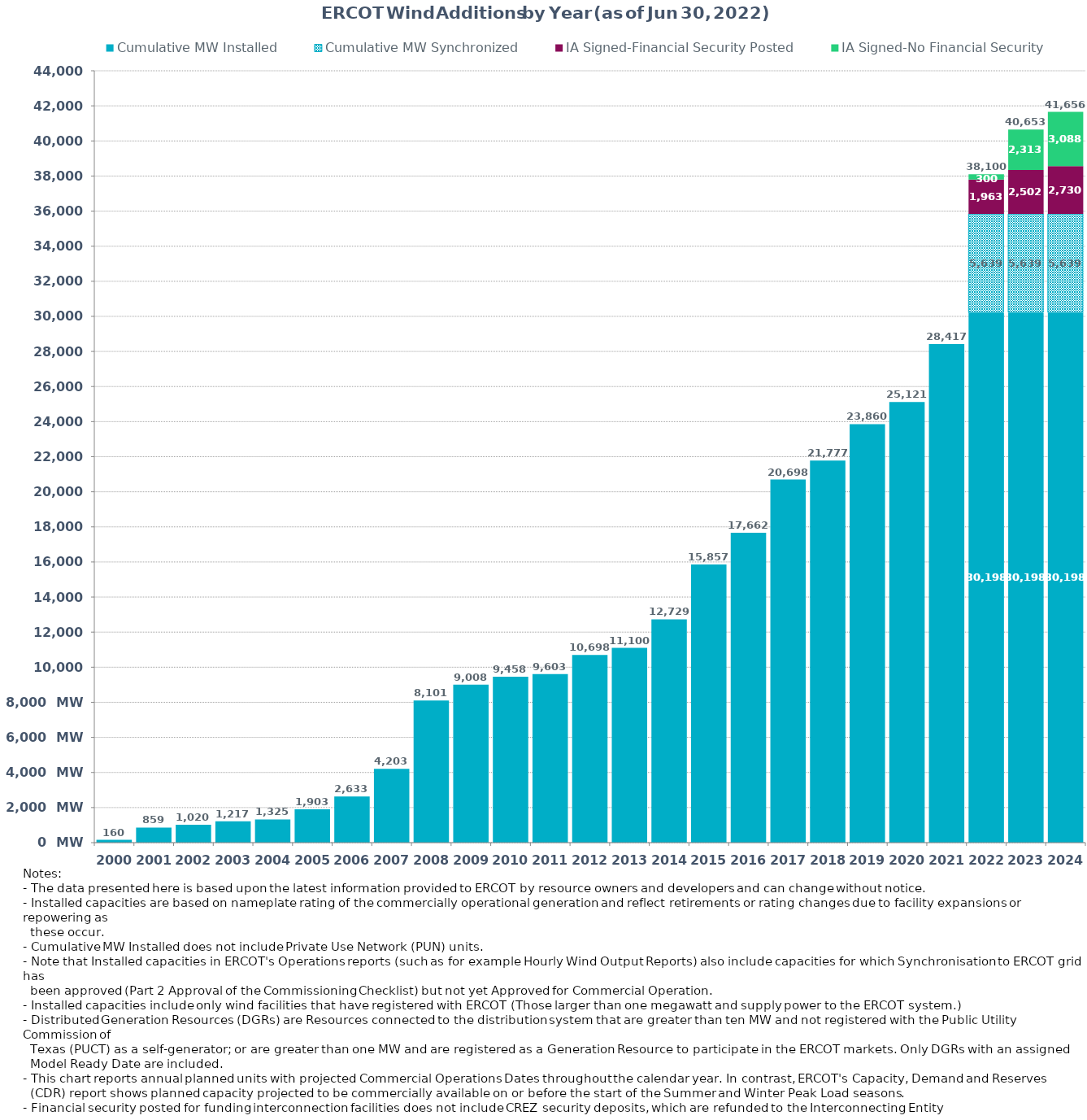
| Category | Cumulative MW Installed | Cumulative MW Synchronized | IA Signed-Financial Security Posted  | IA Signed-No Financial Security  | Other Planned | Cumulative Installed and Planned |
|---|---|---|---|---|---|---|
| 2000.0 | 160.37 | 0 | 0 | 0 | 0 | 160.37 |
| 2001.0 | 859.29 | 0 | 0 | 0 | 0 | 859.29 |
| 2002.0 | 1019.79 | 0 | 0 | 0 | 0 | 1019.79 |
| 2003.0 | 1217.29 | 0 | 0 | 0 | 0 | 1217.29 |
| 2004.0 | 1325.29 | 0 | 0 | 0 | 0 | 1325.29 |
| 2005.0 | 1902.69 | 0 | 0 | 0 | 0 | 1902.69 |
| 2006.0 | 2633.39 | 0 | 0 | 0 | 0 | 2633.39 |
| 2007.0 | 4203.41 | 0 | 0 | 0 | 0 | 4203.41 |
| 2008.0 | 8101.01 | 0 | 0 | 0 | 0 | 8101.01 |
| 2009.0 | 9007.57 | 0 | 0 | 0 | 0 | 9007.57 |
| 2010.0 | 9458.49 | 0 | 0 | 0 | 0 | 9458.49 |
| 2011.0 | 9603.49 | 0 | 0 | 0 | 0 | 9603.49 |
| 2012.0 | 10698.35 | 0 | 0 | 0 | 0 | 10698.35 |
| 2013.0 | 11100.05 | 0 | 0 | 0 | 0 | 11100.05 |
| 2014.0 | 12728.93 | 0 | 0 | 0 | 0 | 12728.93 |
| 2015.0 | 15857.48 | 0 | 0 | 0 | 0 | 15857.48 |
| 2016.0 | 17662.45 | 0 | 0 | 0 | 0 | 17662.45 |
| 2017.0 | 20697.84 | 0 | 0 | 0 | 0 | 20697.84 |
| 2018.0 | 21777 | 0 | 0 | 0 | 0 | 21777 |
| 2019.0 | 23860 | 0 | 0 | 0 | 0 | 23860 |
| 2020.0 | 25121 | 0 | 0 | 0 | 0 | 25121 |
| 2021.0 | 28416.82 | 0 | 0 | 0 | 0 | 28416.82 |
| 2022.0 | 30198.38 | 5639.44 | 1963.14 | 299.5 | 0 | 38100.46 |
| 2023.0 | 30198.38 | 5639.44 | 2501.54 | 2313.2 | 0 | 40652.56 |
| 2024.0 | 30198.38 | 5639.44 | 2729.54 | 3088.26 | 0 | 41655.62 |